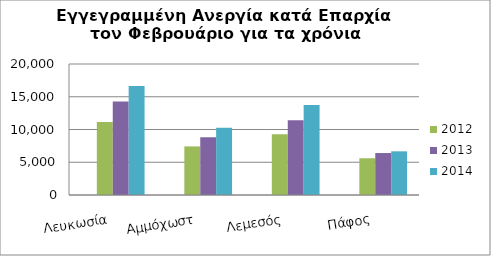
| Category | 2010 | 2012 | 2013 | 2014 |
|---|---|---|---|---|
| Λευκωσία | 0 | 11157 | 14267 | 16632 |
| Αμμόχωστ | 0 | 7419 | 8812 | 10255 |
| Λεμεσός | 0 | 9261 | 11403 | 13745 |
| Πάφος | 0 | 5610 | 6406 | 6669 |